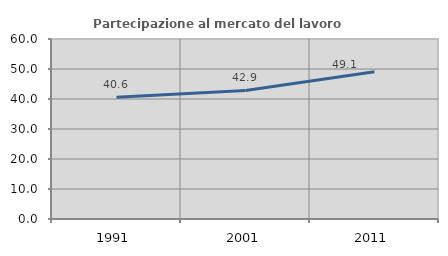
| Category | Partecipazione al mercato del lavoro  femminile |
|---|---|
| 1991.0 | 40.576 |
| 2001.0 | 42.868 |
| 2011.0 | 49.119 |